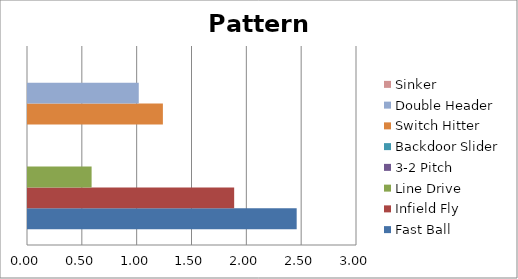
| Category | Fast Ball | Infield Fly | Line Drive | 3-2 Pitch | Backdoor Slider | Switch Hitter | Double Header | Sinker |
|---|---|---|---|---|---|---|---|---|
| 0 | 2.45 | 1.88 | 0.58 | 0 | 0 | 1.23 | 1.01 | 0 |